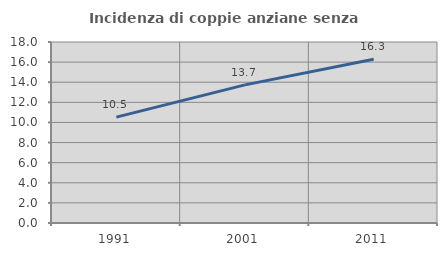
| Category | Incidenza di coppie anziane senza figli  |
|---|---|
| 1991.0 | 10.526 |
| 2001.0 | 13.738 |
| 2011.0 | 16.294 |